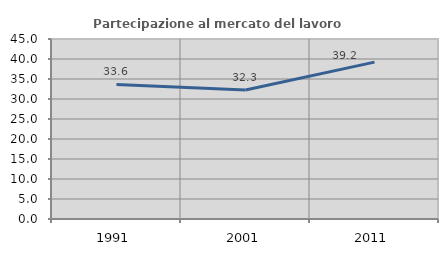
| Category | Partecipazione al mercato del lavoro  femminile |
|---|---|
| 1991.0 | 33.643 |
| 2001.0 | 32.259 |
| 2011.0 | 39.216 |